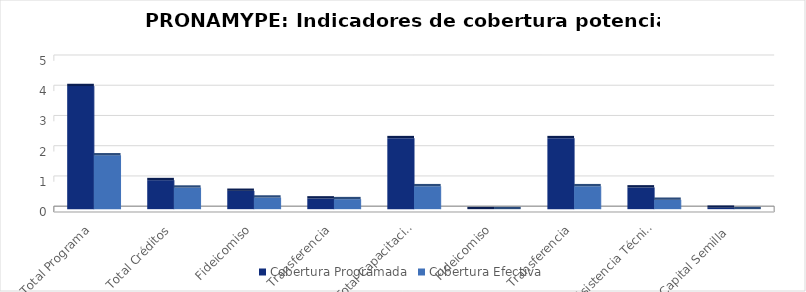
| Category | Cobertura Programada | Cobertura Efectiva |
|---|---|---|
| Total Programa | 4.07 | 1.779 |
| Total Créditos | 0.959 | 0.712 |
| Fideicomiso | 0.606 | 0.383 |
| Transferencia | 0.353 | 0.33 |
| Total Capacitación | 2.347 | 0.758 |
| Fideicomiso | 0 | 0 |
| Transferencia | 2.347 | 0.758 |
| Asistencia Técnica  | 0.718 | 0.309 |
| Capital Semilla  | 0.046 | 0 |